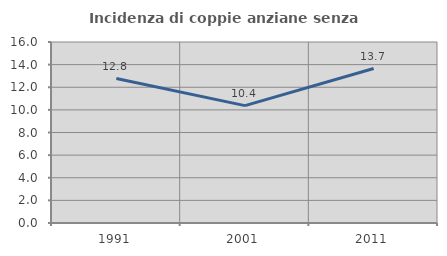
| Category | Incidenza di coppie anziane senza figli  |
|---|---|
| 1991.0 | 12.766 |
| 2001.0 | 10.373 |
| 2011.0 | 13.653 |